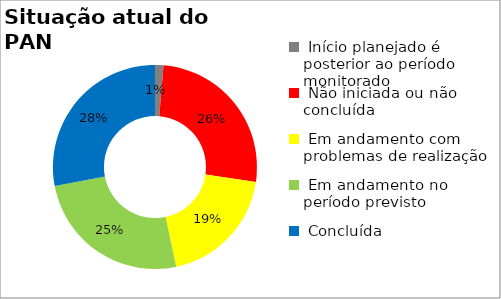
| Category | Series 0 |
|---|---|
|  Início planejado é posterior ao período monitorado | 0.013 |
|  Não iniciada ou não concluída | 0.26 |
|  Em andamento com problemas de realização | 0.193 |
|  Em andamento no período previsto  | 0.253 |
|  Concluída | 0.28 |